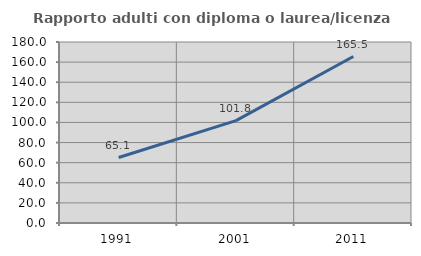
| Category | Rapporto adulti con diploma o laurea/licenza media  |
|---|---|
| 1991.0 | 65.083 |
| 2001.0 | 101.751 |
| 2011.0 | 165.525 |